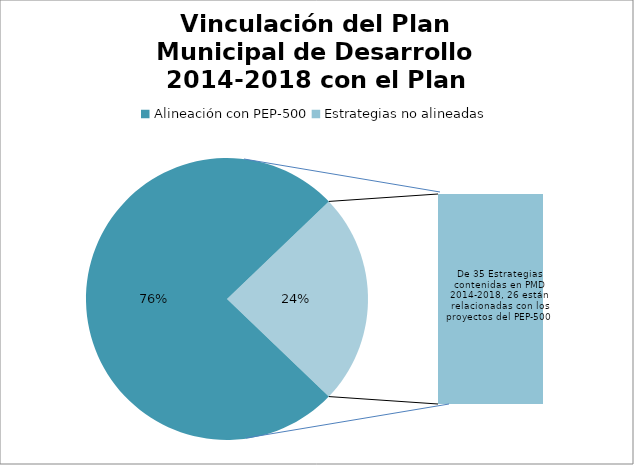
| Category | Plan Municipal de Desarrollo 2014-2018 |
|---|---|
| Alineación con PEP-500 | 28 |
| Estrategias no alineadas | 9 |